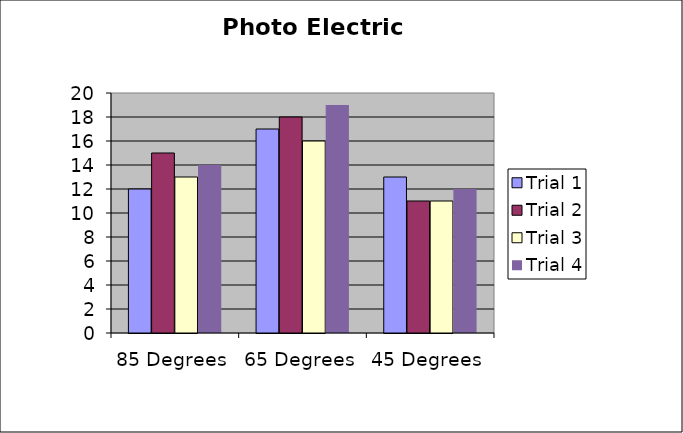
| Category | Trial 1 | Trial 2 | Trial 3 | Trial 4 |
|---|---|---|---|---|
| 85 Degrees | 12 | 15 | 13 | 14 |
| 65 Degrees | 17 | 18 | 16 | 19 |
| 45 Degrees | 13 | 11 | 11 | 12 |